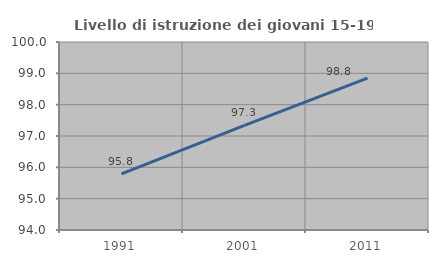
| Category | Livello di istruzione dei giovani 15-19 anni |
|---|---|
| 1991.0 | 95.79 |
| 2001.0 | 97.34 |
| 2011.0 | 98.847 |